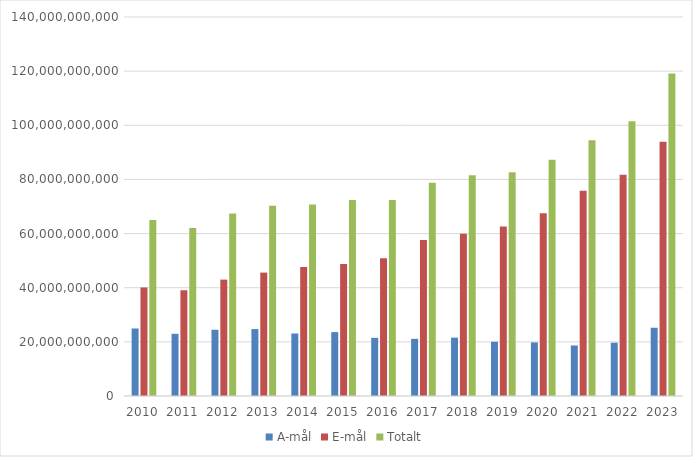
| Category | A-mål | E-mål | Totalt |
|---|---|---|---|
| 2010.0 | 24945752674 | 40103634064 | 65049386738 |
| 2011.0 | 22969806320 | 39053876936 | 62023683256 |
| 2012.0 | 24472022718 | 42986573713 | 67458596431 |
| 2013.0 | 24723698977 | 45590047798 | 70313746775 |
| 2014.0 | 23090343570 | 47662609473 | 70752953043 |
| 2015.0 | 23596671918 | 48802048954 | 72398720872 |
| 2016.0 | 21481652882 | 50908704749 | 72390357631 |
| 2017.0 | 21115606503 | 57616792687 | 78732399190 |
| 2018.0 | 21551242435 | 59962467055 | 81513709490 |
| 2019.0 | 20027727930 | 62636899184 | 82664627114 |
| 2020.0 | 19796344372 | 67504169122 | 87300513494 |
| 2021.0 | 18652409623 | 75777795035 | 94430204658 |
| 2022.0 | 19682930845 | 81767503819 | 101450434664 |
| 2023.0 | 25215373258 | 93883756749 | 119099130007 |